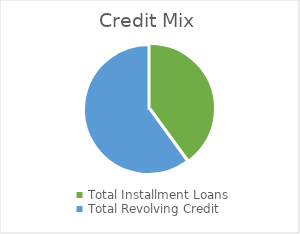
| Category | Series 0 |
|---|---|
| Total Installment Loans | 2 |
| Total Revolving Credit | 3 |